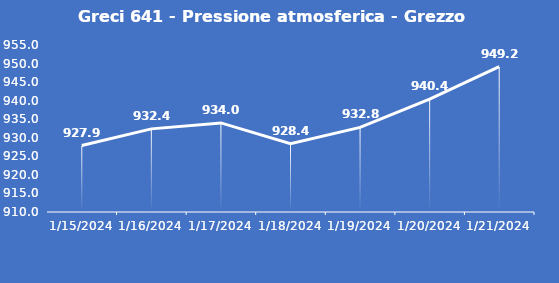
| Category | Greci 641 - Pressione atmosferica - Grezzo (hPa) |
|---|---|
| 1/15/24 | 927.9 |
| 1/16/24 | 932.4 |
| 1/17/24 | 934 |
| 1/18/24 | 928.4 |
| 1/19/24 | 932.8 |
| 1/20/24 | 940.4 |
| 1/21/24 | 949.2 |